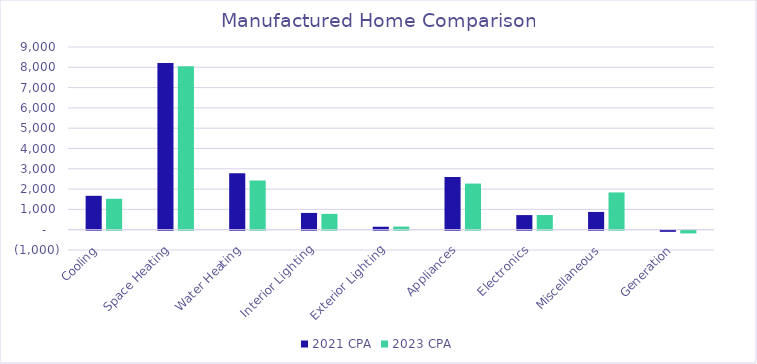
| Category | 2021 CPA | 2023 CPA |
|---|---|---|
|  Cooling  | 1669.291 | 1525.04 |
|  Space Heating  | 8217.923 | 8048.355 |
|  Water Heating  | 2775.311 | 2424.202 |
|  Interior Lighting  | 826.317 | 780.435 |
|  Exterior Lighting  | 145.842 | 153.971 |
|  Appliances  | 2594.209 | 2271.815 |
|  Electronics  | 720.213 | 724.15 |
|  Miscellaneous  | 875.042 | 1835.593 |
|  Generation  | -56.594 | -134.749 |